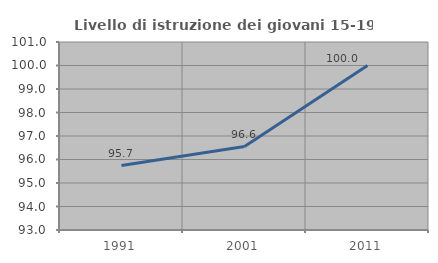
| Category | Livello di istruzione dei giovani 15-19 anni |
|---|---|
| 1991.0 | 95.745 |
| 2001.0 | 96.552 |
| 2011.0 | 100 |